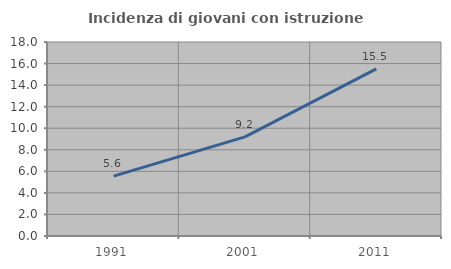
| Category | Incidenza di giovani con istruzione universitaria |
|---|---|
| 1991.0 | 5.556 |
| 2001.0 | 9.196 |
| 2011.0 | 15.502 |